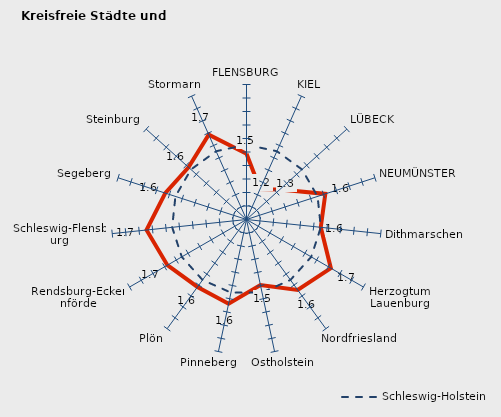
| Category | Kreise | Schleswig-Holstein |
|---|---|---|
| FLENSBURG | 1.487 | 1.554 |
| KIEL | 1.248 | 1.554 |
| LÜBECK | 1.332 | 1.554 |
| NEUMÜNSTER | 1.614 | 1.554 |
| Dithmarschen | 1.553 | 1.554 |
| Herzogtum Lauenburg | 1.722 | 1.554 |
| Nordfriesland | 1.645 | 1.554 |
| Ostholstein | 1.496 | 1.554 |
| Pinneberg | 1.638 | 1.554 |
| Plön | 1.617 | 1.554 |
| Rendsburg-Eckernförde | 1.677 | 1.554 |
| Schleswig-Flensburg | 1.745 | 1.554 |
| Segeberg | 1.633 | 1.554 |
| Steinburg | 1.578 | 1.554 |
| Stormarn | 1.687 | 1.554 |